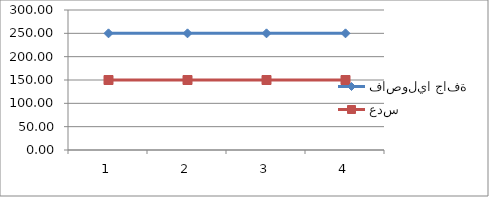
| Category | فاصوليا جافة | عدس |
|---|---|---|
| 0 | 250 | 150 |
| 1 | 250 | 150 |
| 2 | 250 | 150 |
| 3 | 250 | 150 |